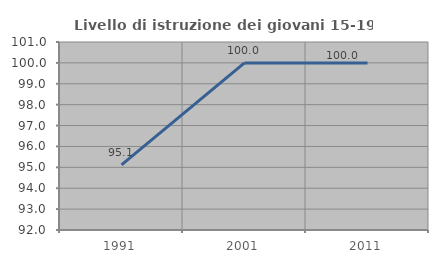
| Category | Livello di istruzione dei giovani 15-19 anni |
|---|---|
| 1991.0 | 95.122 |
| 2001.0 | 100 |
| 2011.0 | 100 |